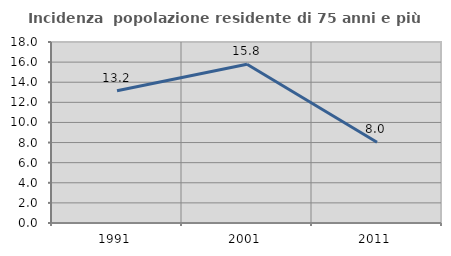
| Category | Incidenza  popolazione residente di 75 anni e più |
|---|---|
| 1991.0 | 13.158 |
| 2001.0 | 15.789 |
| 2011.0 | 8.029 |